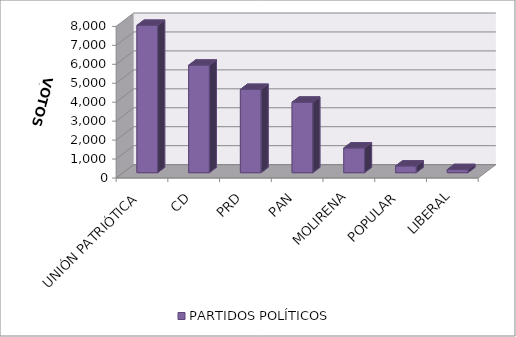
| Category | PARTIDOS POLÍTICOS |
|---|---|
| UNIÓN PATRIÓTICA | 7774 |
| CD | 5672 |
| PRD | 4394 |
| PAN | 3719 |
| MOLIRENA | 1305 |
| POPULAR | 352 |
| LIBERAL | 163 |